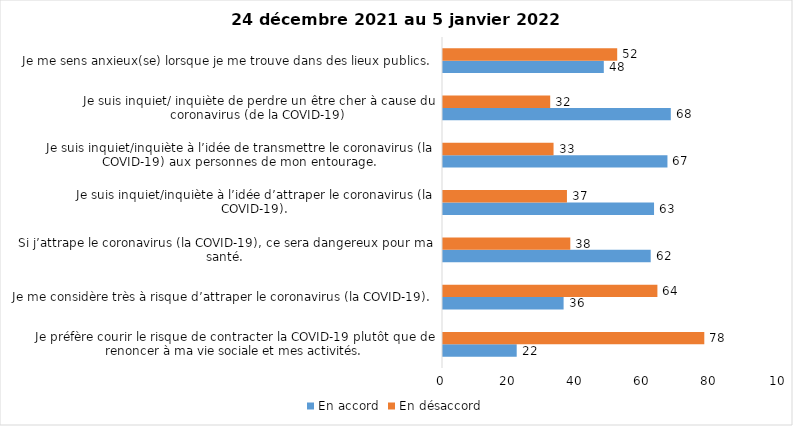
| Category | En accord | En désaccord |
|---|---|---|
| Je préfère courir le risque de contracter la COVID-19 plutôt que de renoncer à ma vie sociale et mes activités. | 22 | 78 |
| Je me considère très à risque d’attraper le coronavirus (la COVID-19). | 36 | 64 |
| Si j’attrape le coronavirus (la COVID-19), ce sera dangereux pour ma santé. | 62 | 38 |
| Je suis inquiet/inquiète à l’idée d’attraper le coronavirus (la COVID-19). | 63 | 37 |
| Je suis inquiet/inquiète à l’idée de transmettre le coronavirus (la COVID-19) aux personnes de mon entourage. | 67 | 33 |
| Je suis inquiet/ inquiète de perdre un être cher à cause du coronavirus (de la COVID-19) | 68 | 32 |
| Je me sens anxieux(se) lorsque je me trouve dans des lieux publics. | 48 | 52 |